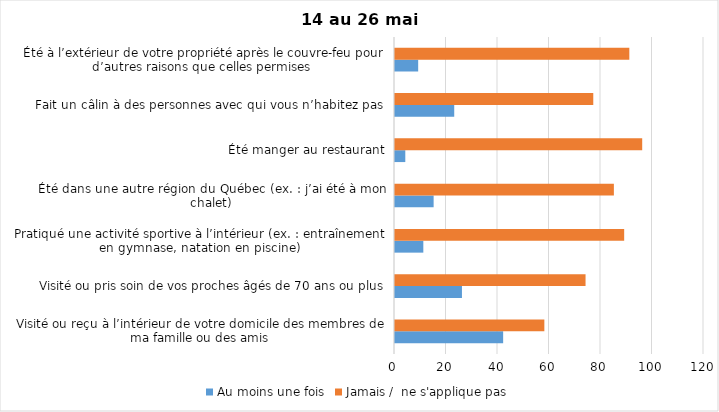
| Category | Au moins une fois | Jamais /  ne s'applique pas |
|---|---|---|
| Visité ou reçu à l’intérieur de votre domicile des membres de ma famille ou des amis | 42 | 58 |
| Visité ou pris soin de vos proches âgés de 70 ans ou plus | 26 | 74 |
| Pratiqué une activité sportive à l’intérieur (ex. : entraînement en gymnase, natation en piscine) | 11 | 89 |
| Été dans une autre région du Québec (ex. : j’ai été à mon chalet) | 15 | 85 |
| Été manger au restaurant | 4 | 96 |
| Fait un câlin à des personnes avec qui vous n’habitez pas | 23 | 77 |
| Été à l’extérieur de votre propriété après le couvre-feu pour d’autres raisons que celles permises  | 9 | 91 |